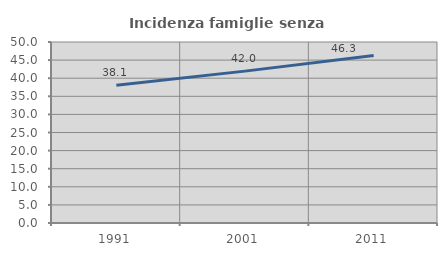
| Category | Incidenza famiglie senza nuclei |
|---|---|
| 1991.0 | 38.065 |
| 2001.0 | 41.953 |
| 2011.0 | 46.302 |